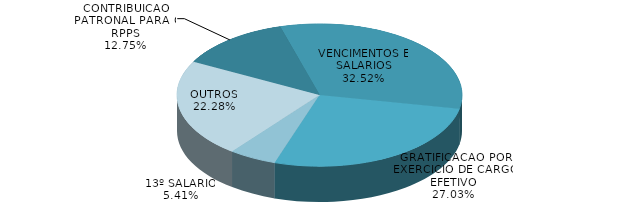
| Category | Series 0 | Series 1 |
|---|---|---|
| CONTRIBUICAO PATRONAL PARA O RPPS | 33486384.58 | 0.128 |
| VENCIMENTOS E SALARIOS | 85391640.92 | 0.325 |
| GRATIFICACAO POR EXERCICIO DE CARGO EFETIVO | 70969573.49 | 0.27 |
| 13º SALARIO | 14212799.12 | 0.054 |
| OUTROS | 58508998.89 | 0.223 |